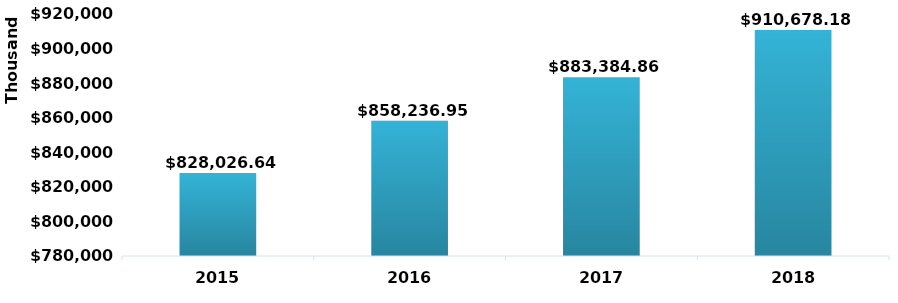
| Category | Total |
|---|---|
| 2015 | 828026638.67 |
| 2016 | 858236950.18 |
| 2017 | 883384864.92 |
| 2018 | 910678178.78 |